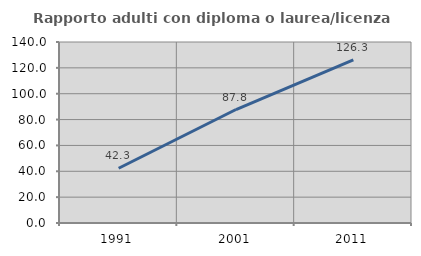
| Category | Rapporto adulti con diploma o laurea/licenza media  |
|---|---|
| 1991.0 | 42.336 |
| 2001.0 | 87.768 |
| 2011.0 | 126.25 |